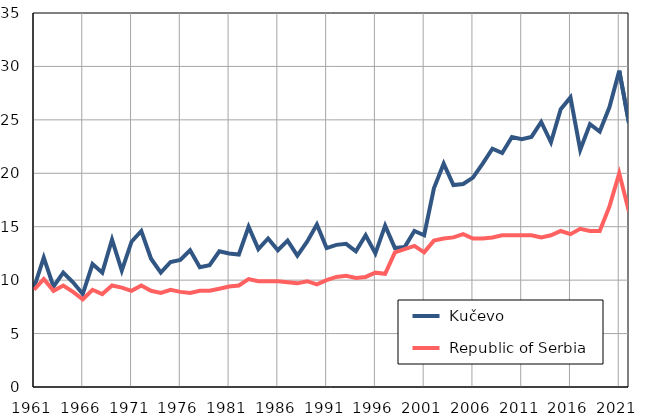
| Category |  Kučevo |  Republic of Serbia |
|---|---|---|
| 1961.0 | 9.3 | 9.1 |
| 1962.0 | 12.1 | 10.1 |
| 1963.0 | 9.4 | 9 |
| 1964.0 | 10.7 | 9.5 |
| 1965.0 | 9.8 | 8.9 |
| 1966.0 | 8.7 | 8.2 |
| 1967.0 | 11.5 | 9.1 |
| 1968.0 | 10.7 | 8.7 |
| 1969.0 | 13.8 | 9.5 |
| 1970.0 | 10.9 | 9.3 |
| 1971.0 | 13.6 | 9 |
| 1972.0 | 14.6 | 9.5 |
| 1973.0 | 12 | 9 |
| 1974.0 | 10.7 | 8.8 |
| 1975.0 | 11.7 | 9.1 |
| 1976.0 | 11.9 | 8.9 |
| 1977.0 | 12.8 | 8.8 |
| 1978.0 | 11.2 | 9 |
| 1979.0 | 11.4 | 9 |
| 1980.0 | 12.7 | 9.2 |
| 1981.0 | 12.5 | 9.4 |
| 1982.0 | 12.4 | 9.5 |
| 1983.0 | 15 | 10.1 |
| 1984.0 | 12.9 | 9.9 |
| 1985.0 | 13.9 | 9.9 |
| 1986.0 | 12.8 | 9.9 |
| 1987.0 | 13.7 | 9.8 |
| 1988.0 | 12.3 | 9.7 |
| 1989.0 | 13.6 | 9.9 |
| 1990.0 | 15.2 | 9.6 |
| 1991.0 | 13 | 10 |
| 1992.0 | 13.3 | 10.3 |
| 1993.0 | 13.4 | 10.4 |
| 1994.0 | 12.7 | 10.2 |
| 1995.0 | 14.2 | 10.3 |
| 1996.0 | 12.5 | 10.7 |
| 1997.0 | 15.1 | 10.6 |
| 1998.0 | 13 | 12.6 |
| 1999.0 | 13.1 | 12.9 |
| 2000.0 | 14.6 | 13.2 |
| 2001.0 | 14.2 | 12.6 |
| 2002.0 | 18.6 | 13.7 |
| 2003.0 | 20.9 | 13.9 |
| 2004.0 | 18.9 | 14 |
| 2005.0 | 19 | 14.3 |
| 2006.0 | 19.6 | 13.9 |
| 2007.0 | 20.9 | 13.9 |
| 2008.0 | 22.3 | 14 |
| 2009.0 | 21.9 | 14.2 |
| 2010.0 | 23.4 | 14.2 |
| 2011.0 | 23.2 | 14.2 |
| 2012.0 | 23.4 | 14.2 |
| 2013.0 | 24.8 | 14 |
| 2014.0 | 22.9 | 14.2 |
| 2015.0 | 26 | 14.6 |
| 2016.0 | 27.1 | 14.3 |
| 2017.0 | 22.2 | 14.8 |
| 2018.0 | 24.6 | 14.6 |
| 2019.0 | 23.9 | 14.6 |
| 2020.0 | 26.2 | 16.9 |
| 2021.0 | 29.6 | 20 |
| 2022.0 | 24.7 | 16.4 |